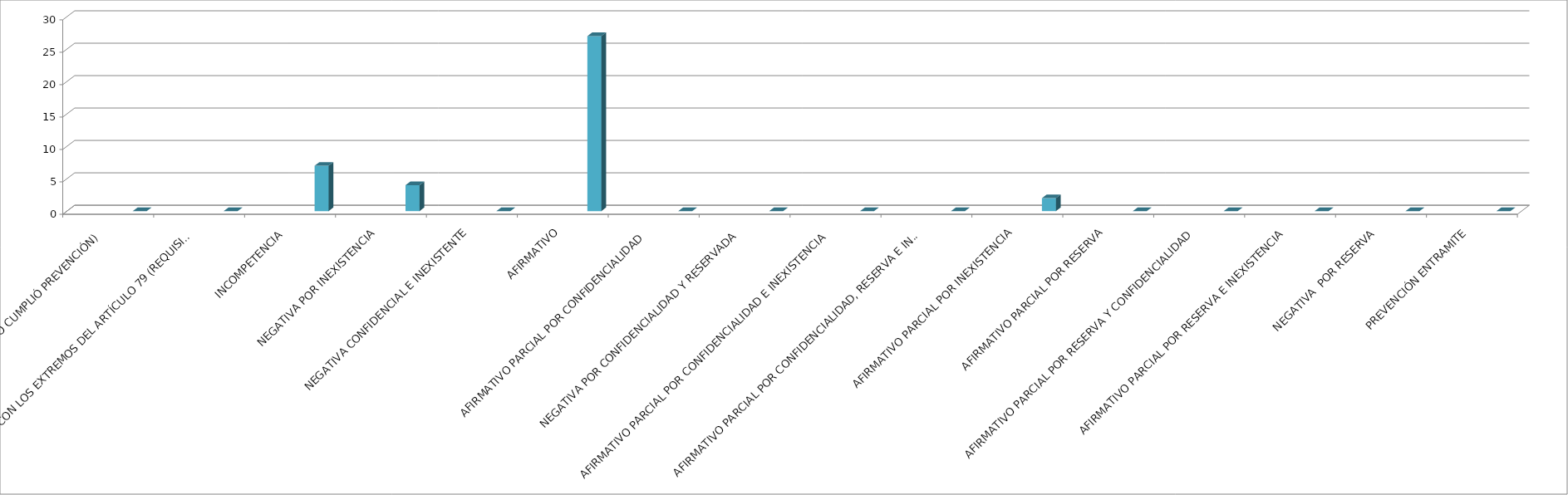
| Category | Series 0 | Series 1 | Series 2 | Series 3 | Series 4 |
|---|---|---|---|---|---|
| SE TIENE POR NO PRESENTADA ( NO CUMPLIÓ PREVENCIÓN) |  |  |  |  | 0 |
| NO CUMPLIO CON LOS EXTREMOS DEL ARTÍCULO 79 (REQUISITOS) |  |  |  |  | 0 |
| INCOMPETENCIA  |  |  |  |  | 7 |
| NEGATIVA POR INEXISTENCIA |  |  |  |  | 4 |
| NEGATIVA CONFIDENCIAL E INEXISTENTE |  |  |  |  | 0 |
| AFIRMATIVO |  |  |  |  | 27 |
| AFIRMATIVO PARCIAL POR CONFIDENCIALIDAD  |  |  |  |  | 0 |
| NEGATIVA POR CONFIDENCIALIDAD Y RESERVADA |  |  |  |  | 0 |
| AFIRMATIVO PARCIAL POR CONFIDENCIALIDAD E INEXISTENCIA |  |  |  |  | 0 |
| AFIRMATIVO PARCIAL POR CONFIDENCIALIDAD, RESERVA E INEXISTENCIA |  |  |  |  | 0 |
| AFIRMATIVO PARCIAL POR INEXISTENCIA |  |  |  |  | 2 |
| AFIRMATIVO PARCIAL POR RESERVA |  |  |  |  | 0 |
| AFIRMATIVO PARCIAL POR RESERVA Y CONFIDENCIALIDAD |  |  |  |  | 0 |
| AFIRMATIVO PARCIAL POR RESERVA E INEXISTENCIA |  |  |  |  | 0 |
| NEGATIVA  POR RESERVA |  |  |  |  | 0 |
| PREVENCIÓN ENTRAMITE |  |  |  |  | 0 |